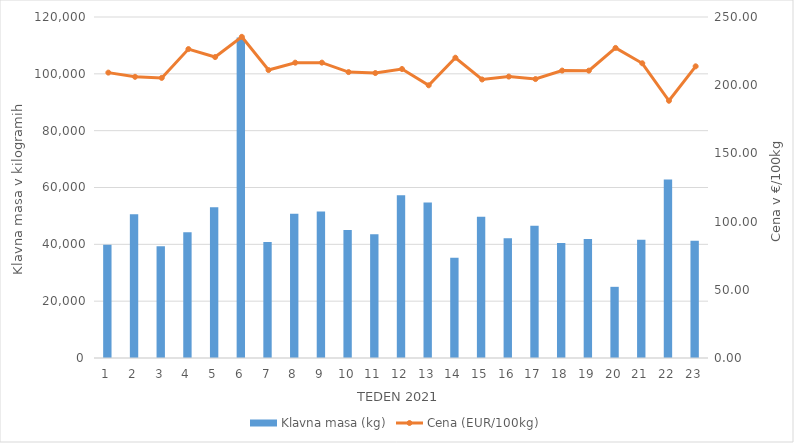
| Category | Klavna masa (kg) |
|---|---|
| 1.0 | 39814 |
| 2.0 | 50603 |
| 3.0 | 39295 |
| 4.0 | 44250 |
| 5.0 | 53061 |
| 6.0 | 112816 |
| 7.0 | 40829 |
| 8.0 | 50775 |
| 9.0 | 51535 |
| 10.0 | 45040 |
| 11.0 | 43536 |
| 12.0 | 57246 |
| 13.0 | 54680 |
| 14.0 | 35237 |
| 15.0 | 49721 |
| 16.0 | 42177 |
| 17.0 | 46525 |
| 18.0 | 40491 |
| 19.0 | 41888 |
| 20.0 | 25048 |
| 21.0 | 41651 |
| 22.0 | 62774 |
| 23.0 | 41297 |